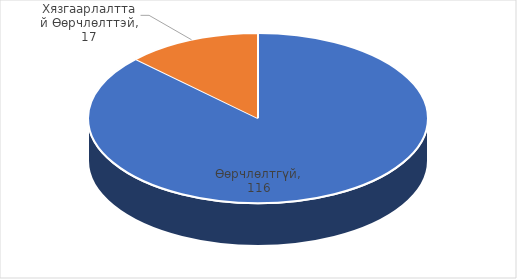
| Category | Total |
|---|---|
| Өөрчлөлтгүй | 116 |
| Хязгаарлалттай Өөрчлөлттэй | 17 |